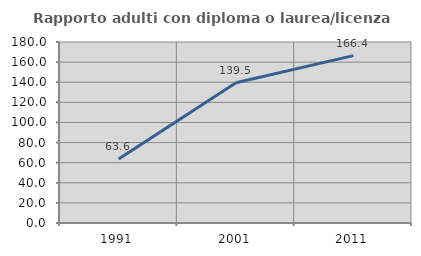
| Category | Rapporto adulti con diploma o laurea/licenza media  |
|---|---|
| 1991.0 | 63.594 |
| 2001.0 | 139.47 |
| 2011.0 | 166.434 |